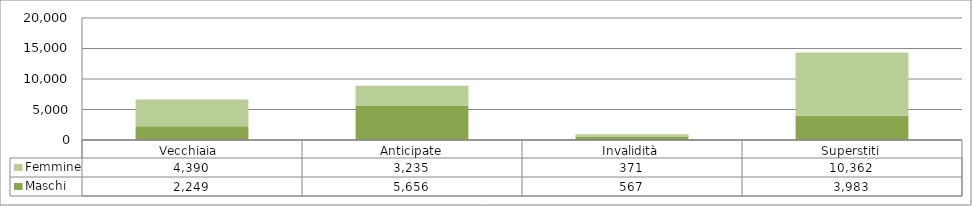
| Category | Maschi | Femmine |
|---|---|---|
| Vecchiaia  | 2249 | 4390 |
| Anticipate | 5656 | 3235 |
| Invalidità | 567 | 371 |
| Superstiti | 3983 | 10362 |